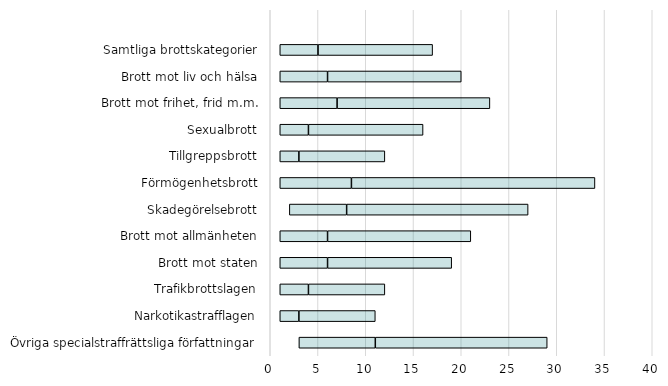
| Category | Series 0 | Series 1 | Series 2 | Series 3 |
|---|---|---|---|---|
| Övriga specialstraffrättsliga författningar | 0 | 3 | 8 | 18 |
| Narkotikastrafflagen | 0 | 1 | 2 | 8 |
| Trafikbrottslagen | 0 | 1 | 3 | 8 |
| Brott mot staten | 0 | 1 | 5 | 13 |
| Brott mot allmänheten | 0 | 1 | 5 | 15 |
| Skadegörelsebrott | 0 | 2 | 6 | 19 |
| Förmögenhetsbrott | 0 | 1 | 7.5 | 25.5 |
| Tillgreppsbrott | 0 | 1 | 2 | 9 |
| Sexualbrott | 0 | 1 | 3 | 12 |
| Brott mot frihet, frid m.m. | 0 | 1 | 6 | 16 |
| Brott mot liv och hälsa | 0 | 1 | 5 | 14 |
| Samtliga brottskategorier | 0 | 1 | 4 | 12 |